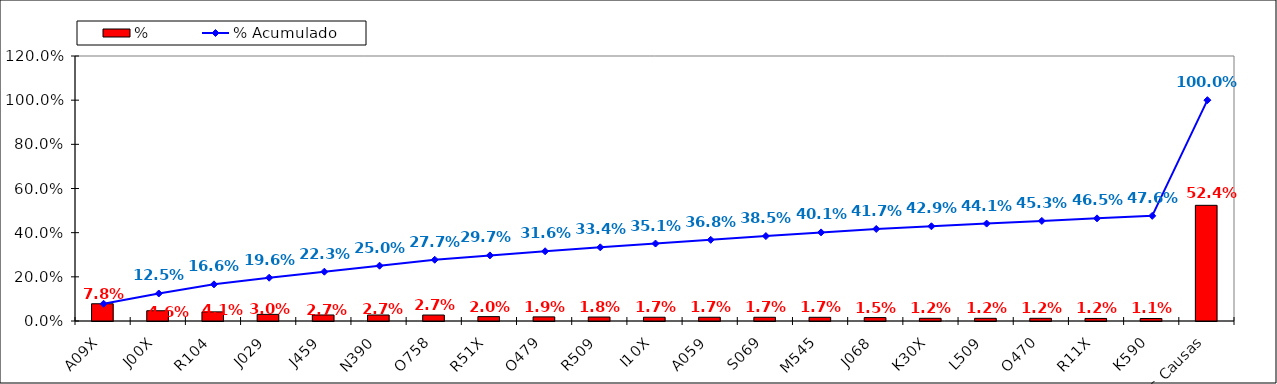
| Category | % |
|---|---|
| A09X | 0.078 |
| J00X | 0.046 |
| R104 | 0.041 |
| J029 | 0.03 |
| J459 | 0.027 |
| N390 | 0.027 |
| O758 | 0.027 |
| R51X | 0.02 |
| O479 | 0.019 |
| R509 | 0.018 |
| I10X | 0.017 |
| A059 | 0.017 |
| S069 | 0.017 |
| M545 | 0.017 |
| J068 | 0.015 |
| K30X | 0.012 |
| L509 | 0.012 |
| O470 | 0.012 |
| R11X | 0.012 |
| K590 | 0.011 |
| Otras Causas | 0.524 |